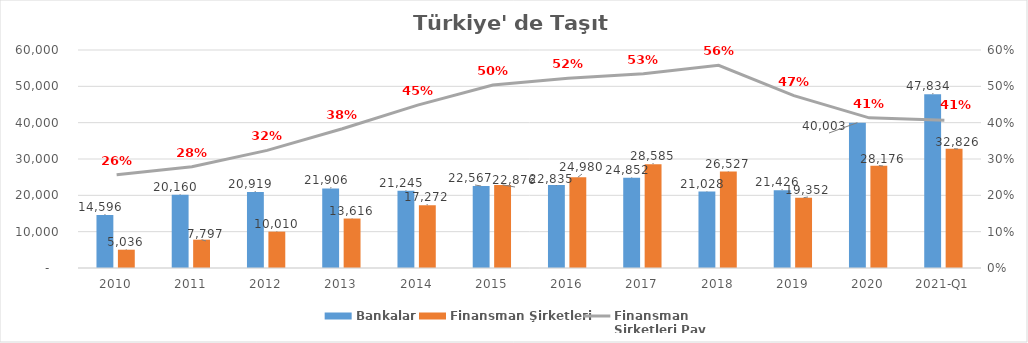
| Category | Bankalar | Finansman Şirketleri |
|---|---|---|
| 2010 | 14596 | 5035.89 |
| 2011 | 20160 | 7796.854 |
| 2012 | 20919 | 10009.755 |
| 2013 | 21906 | 13616.036 |
| 2014 | 21245 | 17271.844 |
| 2015 | 22567 | 22875.563 |
| 2016 | 22835 | 24980.231 |
| 2017 | 24852 | 28584.938 |
| 2018 | 21028 | 26527.133 |
| 2019 | 21426.2 | 19352.327 |
| 2020 | 40002.96 | 28176.3 |
| 2021-Q1 | 47834.2 | 32825.613 |